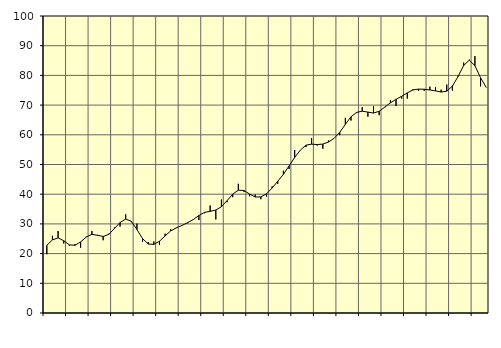
| Category | Piggar | Series 1 |
|---|---|---|
| nan | 19.8 | 22.79 |
| 1.0 | 26 | 24.59 |
| 1.0 | 27.6 | 25.3 |
| 1.0 | 23.4 | 24.34 |
| nan | 22.7 | 22.93 |
| 2.0 | 23.2 | 22.82 |
| 2.0 | 22 | 23.93 |
| 2.0 | 25.7 | 25.58 |
| nan | 27.6 | 26.48 |
| 3.0 | 26.3 | 26.16 |
| 3.0 | 24.5 | 25.77 |
| 3.0 | 26.7 | 26.47 |
| nan | 28.8 | 28.43 |
| 4.0 | 29.1 | 30.46 |
| 4.0 | 33.2 | 31.63 |
| 4.0 | 30.6 | 30.88 |
| nan | 30.1 | 28.1 |
| 5.0 | 24 | 25.06 |
| 5.0 | 23.9 | 23.24 |
| 5.0 | 24.1 | 23.09 |
| nan | 22.9 | 24.16 |
| 6.0 | 26.7 | 25.95 |
| 6.0 | 28.2 | 27.65 |
| 6.0 | 28.6 | 28.67 |
| nan | 29.5 | 29.48 |
| 7.0 | 30.2 | 30.42 |
| 7.0 | 31.4 | 31.45 |
| 7.0 | 31.3 | 32.83 |
| nan | 33.6 | 33.87 |
| 8.0 | 36.2 | 34.24 |
| 8.0 | 31.5 | 34.65 |
| 8.0 | 38.2 | 35.79 |
| nan | 37.3 | 37.82 |
| 9.0 | 39 | 40.04 |
| 9.0 | 43.5 | 41.34 |
| 9.0 | 40.8 | 41.25 |
| nan | 39.3 | 40.06 |
| 10.0 | 39.9 | 39.05 |
| 10.0 | 38.3 | 39.08 |
| 10.0 | 39.2 | 40.14 |
| nan | 42.6 | 42.06 |
| 11.0 | 43.5 | 44.39 |
| 11.0 | 47.9 | 46.7 |
| 11.0 | 48.5 | 49.49 |
| nan | 54.9 | 52.37 |
| 12.0 | 54.8 | 54.82 |
| 12.0 | 55.9 | 56.51 |
| 12.0 | 58.9 | 56.85 |
| nan | 56.4 | 56.72 |
| 13.0 | 55.3 | 56.87 |
| 13.0 | 58.1 | 57.55 |
| 13.0 | 58.8 | 58.82 |
| nan | 59.9 | 60.81 |
| 14.0 | 65.7 | 63.52 |
| 14.0 | 64.8 | 66.07 |
| 14.0 | 67.3 | 67.55 |
| nan | 69.3 | 67.95 |
| 15.0 | 66.1 | 67.64 |
| 15.0 | 69.6 | 67.32 |
| 15.0 | 66.6 | 67.92 |
| nan | 69.2 | 69.33 |
| 16.0 | 71.6 | 70.76 |
| 16.0 | 69.7 | 71.95 |
| 16.0 | 72.2 | 72.99 |
| nan | 72.2 | 74.12 |
| 17.0 | 75.3 | 75.09 |
| 17.0 | 74.8 | 75.39 |
| 17.0 | 74.8 | 75.34 |
| nan | 76.2 | 75.1 |
| 18.0 | 76 | 74.78 |
| 18.0 | 75.2 | 74.4 |
| 18.0 | 76.9 | 74.68 |
| nan | 74.9 | 76.38 |
| 19.0 | 79.9 | 79.59 |
| 19.0 | 84.3 | 83.34 |
| 19.0 | 85.3 | 85.12 |
| nan | 86.5 | 83.26 |
| 20.0 | 76.3 | 79.22 |
| 20.0 | 75.9 | 75.98 |